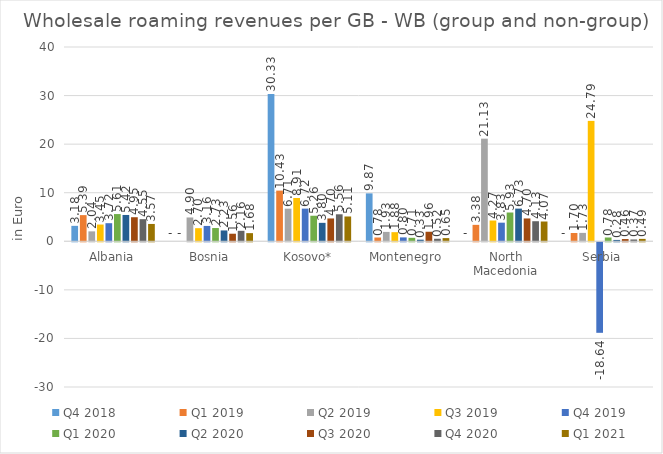
| Category | Q4 2018 | Q1 2019 | Q2 2019 | Q3 2019 | Q4 2019 | Q1 2020 | Q2 2020 | Q3 2020 | Q4 2020 | Q1 2021 |
|---|---|---|---|---|---|---|---|---|---|---|
| Albania | 3.179 | 5.388 | 2.042 | 3.447 | 3.724 | 5.605 | 5.419 | 4.953 | 4.555 | 3.568 |
| Bosnia | 0 | 0 | 4.903 | 2.698 | 3.16 | 2.729 | 2.232 | 1.559 | 2.158 | 1.678 |
| Kosovo* | 30.334 | 10.434 | 6.715 | 8.914 | 6.725 | 5.261 | 3.797 | 4.701 | 5.557 | 5.106 |
| Montenegro | 9.865 | 0.776 | 1.932 | 1.877 | 0.801 | 0.712 | 0.334 | 1.964 | 0.522 | 0.654 |
| North Macedonia | 0 | 3.382 | 21.128 | 4.274 | 3.831 | 5.925 | 6.725 | 4.701 | 4.13 | 4.072 |
| Serbia | 0 | 1.704 | 1.73 | 24.787 | -18.639 | 0.778 | 0.28 | 0.459 | 0.372 | 0.492 |